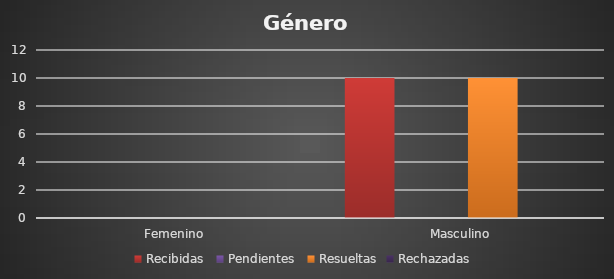
| Category | Recibidas  | Pendientes  | Resueltas | Rechazadas  |
|---|---|---|---|---|
| Femenino  | 0 | 0 | 0 | 0 |
| Masculino | 10 | 0 | 10 | 0 |